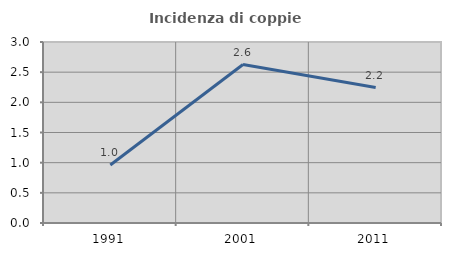
| Category | Incidenza di coppie miste |
|---|---|
| 1991.0 | 0.962 |
| 2001.0 | 2.626 |
| 2011.0 | 2.245 |